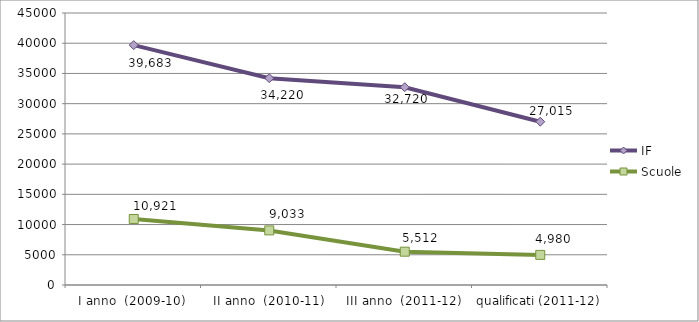
| Category | IF | Scuole |
|---|---|---|
| I anno  (2009-10) | 39683 | 10921 |
| II anno  (2010-11) | 34220 | 9033 |
| III anno  (2011-12) | 32720 | 5512 |
| qualificati (2011-12) | 27015 | 4980 |